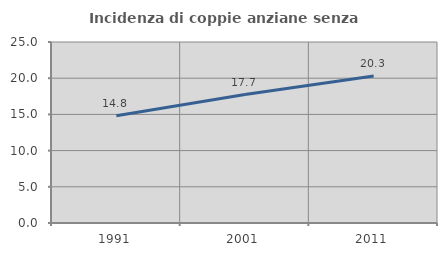
| Category | Incidenza di coppie anziane senza figli  |
|---|---|
| 1991.0 | 14.821 |
| 2001.0 | 17.74 |
| 2011.0 | 20.306 |